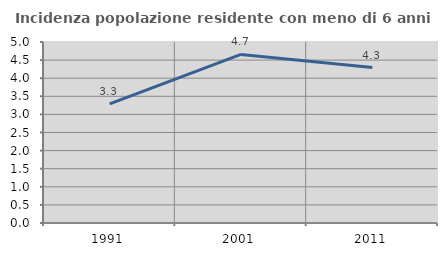
| Category | Incidenza popolazione residente con meno di 6 anni |
|---|---|
| 1991.0 | 3.291 |
| 2001.0 | 4.658 |
| 2011.0 | 4.294 |